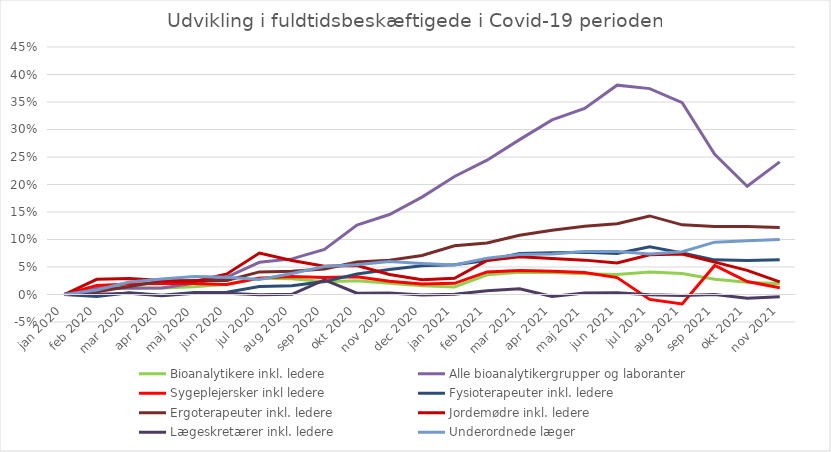
| Category | Stigning i alle grupper eks. administrativt personale  | Bioanalytikere inkl. ledere  | Stigning i laboranter | Alle bioanalytikergrupper og laboranter | Bioanalytikere u. undervisere og ledere | Sygeplejersker inkl ledere | Fysioterapeuter inkl. ledere | Ergoterapeuter inkl. ledere | Jordemødre inkl. ledere | Lægeskretærer inkl. ledere | Overlæger m. fl.  | SOSU'er i alt inkl. ledere | Underordnede læger |
|---|---|---|---|---|---|---|---|---|---|---|---|---|---|
| jan 2020 |  | 0 |  | 0 |  | 0 | 0 | 0 | 0 | 0 |  |  | 0 |
| feb 2020 |  | 0.012 |  | 0.011 |  | 0.017 | -0.003 | 0.005 | 0.028 | 0.001 |  |  | 0.008 |
| mar 2020 |  | 0.012 |  | 0.011 |  | 0.019 | 0.003 | 0.015 | 0.029 | 0.002 |  |  | 0.023 |
| apr 2020 |  | 0.012 |  | 0.012 |  | 0.02 | -0.002 | 0.024 | 0.025 | -0.002 |  |  | 0.028 |
| maj 2020 |  | 0.014 |  | 0.02 |  | 0.02 | 0.004 | 0.025 | 0.024 | 0.002 |  |  | 0.033 |
| jun 2020 |  | 0.019 |  | 0.032 |  | 0.018 | 0.004 | 0.025 | 0.037 | 0.002 |  |  | 0.031 |
| jul 2020 |  | 0.029 |  | 0.059 |  | 0.03 | 0.015 | 0.041 | 0.075 | 0 |  |  | 0.027 |
| aug 2020 |  | 0.029 |  | 0.065 |  | 0.033 | 0.016 | 0.042 | 0.062 | 0 |  |  | 0.038 |
| sep 2020 |  | 0.023 |  | 0.082 |  | 0.031 | 0.023 | 0.046 | 0.051 | 0.027 |  |  | 0.051 |
| okt 2020 |  | 0.025 |  | 0.126 |  | 0.032 | 0.037 | 0.059 | 0.053 | 0.002 |  |  | 0.054 |
| nov 2020 |  | 0.02 |  | 0.145 |  | 0.024 | 0.045 | 0.062 | 0.036 | 0.003 |  |  | 0.06 |
| dec 2020 |  | 0.016 |  | 0.177 |  | 0.019 | 0.052 | 0.071 | 0.027 | -0.001 |  |  | 0.056 |
| jan 2021 |  | 0.014 |  | 0.215 |  | 0.02 | 0.054 | 0.089 | 0.029 | 0.001 |  |  | 0.054 |
| feb 2021 |  | 0.036 |  | 0.244 |  | 0.041 | 0.062 | 0.093 | 0.062 | 0.007 |  |  | 0.066 |
| mar 2021 |  | 0.041 |  | 0.282 |  | 0.043 | 0.075 | 0.108 | 0.069 | 0.01 |  |  | 0.073 |
| apr 2021 |  | 0.04 |  | 0.318 |  | 0.042 | 0.076 | 0.117 | 0.065 | -0.004 |  |  | 0.073 |
| maj 2021 |  | 0.038 |  | 0.338 |  | 0.04 | 0.077 | 0.124 | 0.062 | 0.003 |  |  | 0.078 |
| jun 2021 |  | 0.036 |  | 0.381 |  | 0.031 | 0.075 | 0.129 | 0.057 | 0.003 |  |  | 0.078 |
| jul 2021 |  | 0.041 |  | 0.374 |  | -0.009 | 0.087 | 0.143 | 0.072 | 0 |  |  | 0.073 |
| aug 2021 |  | 0.038 |  | 0.349 |  | -0.017 | 0.076 | 0.127 | 0.074 | -0.002 |  |  | 0.078 |
| sep 2021 |  | 0.028 |  | 0.255 |  | 0.053 | 0.063 | 0.124 | 0.059 | 0 |  |  | 0.095 |
| okt 2021 |  | 0.022 |  | 0.197 |  | 0.024 | 0.062 | 0.124 | 0.044 | -0.007 |  |  | 0.098 |
| nov 2021 |  | 0.019 |  | 0.241 |  | 0.012 | 0.063 | 0.122 | 0.023 | -0.004 |  |  | 0.1 |